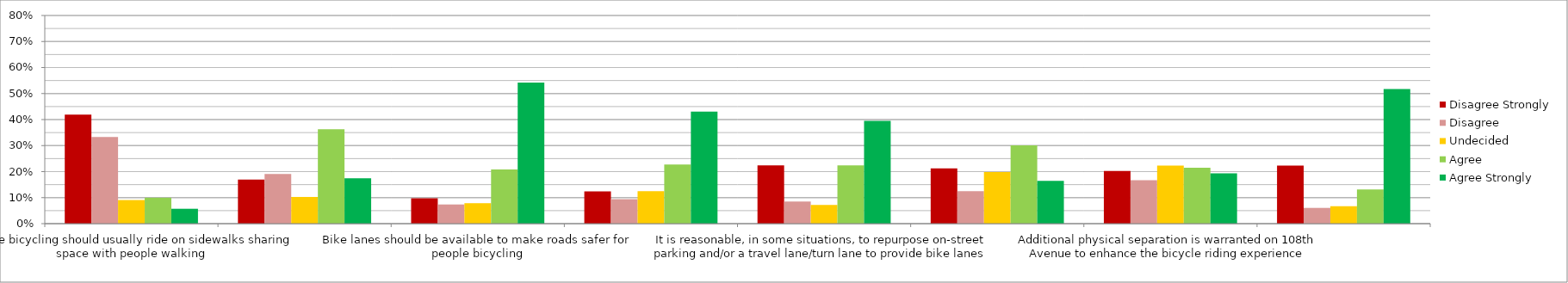
| Category | Disagree Strongly | Disagree | Undecided | Agree | Agree Strongly |
|---|---|---|---|---|---|
| People bicycling should usually ride on sidewalks sharing space with people walking | 0.419 | 0.333 | 0.091 | 0.1 | 0.057 |
| People bicycling should usually ride in the road sharing space with motor vehicles | 0.169 | 0.191 | 0.103 | 0.363 | 0.174 |
| Bike lanes should be available to make roads safer for people bicycling | 0.098 | 0.074 | 0.079 | 0.208 | 0.542 |
| Bike lanes should be separated from motor vehicles  (with curbs and posts and/or planter boxes) to make bicycling safer and more comfortable for more people | 0.124 | 0.094 | 0.124 | 0.228 | 0.43 |
| It is reasonable, in some situations, to repurpose on-street parking and/or a travel lane/turn lane to provide bike lanes | 0.224 | 0.085 | 0.072 | 0.224 | 0.395 |
| The design of 108th Avenue strikes the right balance to address the needs of all street users | 0.212 | 0.125 | 0.198 | 0.301 | 0.164 |
| Additional physical separation is warranted on 108th Avenue to enhance the bicycle riding experience | 0.202 | 0.167 | 0.223 | 0.215 | 0.193 |
| Overall, I would support building more bicycle lanes at other locations in Downtown Bellevue | 0.223 | 0.06 | 0.067 | 0.132 | 0.518 |